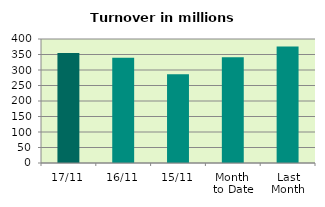
| Category | Series 0 |
|---|---|
| 17/11 | 354.949 |
| 16/11 | 339.569 |
| 15/11 | 286.593 |
| Month 
to Date | 341.372 |
| Last
Month | 375.959 |